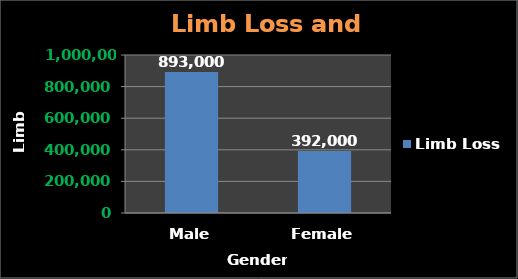
| Category | Limb Loss |
|---|---|
| Male | 893000 |
| Female | 392000 |